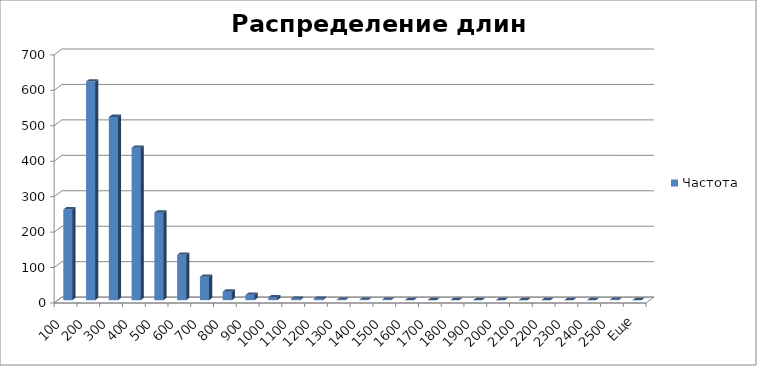
| Category | Частота |
|---|---|
| 100 | 256 |
| 200 | 617 |
| 300 | 517 |
| 400 | 430 |
| 500 | 247 |
| 600 | 128 |
| 700 | 66 |
| 800 | 24 |
| 900 | 15 |
| 1000 | 8 |
| 1100 | 4 |
| 1200 | 4 |
| 1300 | 1 |
| 1400 | 1 |
| 1500 | 1 |
| 1600 | 0 |
| 1700 | 0 |
| 1800 | 0 |
| 1900 | 0 |
| 2000 | 0 |
| 2100 | 0 |
| 2200 | 0 |
| 2300 | 0 |
| 2400 | 0 |
| 2500 | 1 |
| Еще | 0 |